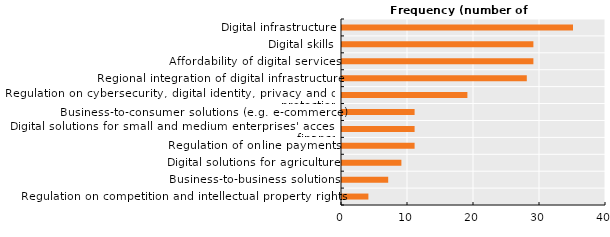
| Category | Series 0 |
|---|---|
| Regulation on competition and intellectual property rights | 4 |
| Business-to-business solutions | 7 |
| Digital solutions for agriculture | 9 |
| Regulation of online payments | 11 |
| Digital solutions for small and medium enterprises' access to finance | 11 |
| Business-to-consumer solutions (e.g. e-commerce) | 11 |
| Regulation on cybersecurity, digital identity, privacy and data protection | 19 |
| Regional integration of digital infrastructure | 28 |
| Affordability of digital services | 29 |
| Digital skills | 29 |
| Digital infrastructure | 35 |